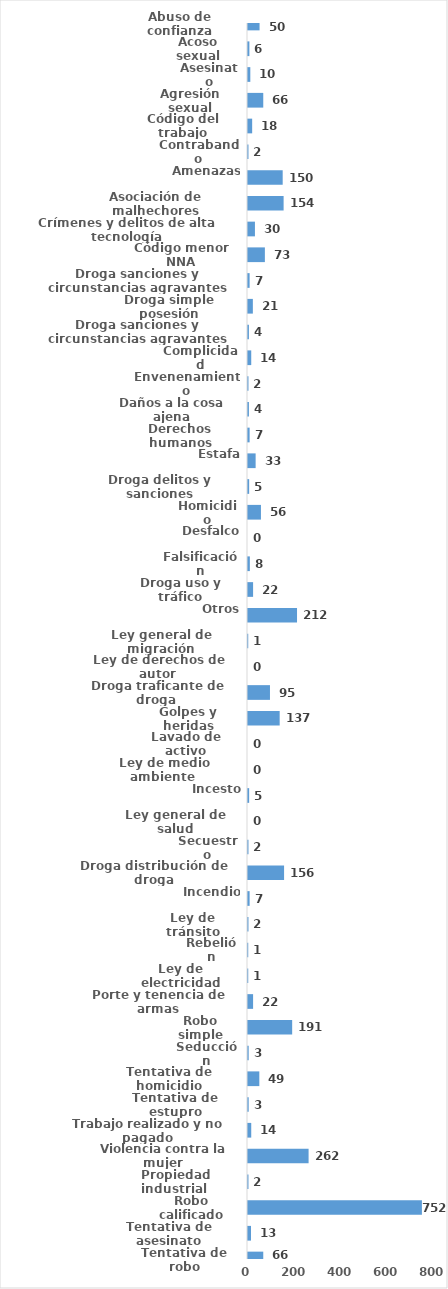
| Category | Series 0 |
|---|---|
| Abuso de confianza | 50 |
| Acoso sexual | 6 |
| Asesinato | 10 |
| Agresión sexual | 66 |
| Código del trabajo | 18 |
| Contrabando | 2 |
| Amenazas | 150 |
| Asociación de malhechores | 154 |
| Crímenes y delitos de alta tecnología | 30 |
| Código menor NNA | 73 |
| Droga sanciones y circunstancias agravantes | 7 |
| Droga simple posesión | 21 |
| Droga sanciones y circunstancias agravantes | 4 |
| Complicidad | 14 |
| Envenenamiento | 2 |
| Daños a la cosa ajena | 4 |
| Derechos humanos | 7 |
| Estafa | 33 |
| Droga delitos y sanciones | 5 |
| Homicidio | 56 |
| Desfalco | 0 |
| Falsificación | 8 |
| Droga uso y tráfico | 22 |
| Otros | 212 |
| Ley general de migración | 1 |
| Ley de derechos de autor  | 0 |
| Droga traficante de droga  | 95 |
| Golpes y heridas | 137 |
| Lavado de activo | 0 |
| Ley de medio ambiente  | 0 |
| Incesto | 5 |
| Ley general de salud | 0 |
| Secuestro | 2 |
| Droga distribución de droga | 156 |
| Incendio | 7 |
| Ley de tránsito | 2 |
| Rebelión | 1 |
| Ley de electricidad | 1 |
| Porte y tenencia de armas | 22 |
| Robo simple | 191 |
| Seducción | 3 |
| Tentativa de homicidio | 49 |
| Tentativa de estupro | 3 |
| Trabajo realizado y no pagado | 14 |
| Violencia contra la mujer | 262 |
| Propiedad industrial  | 2 |
| Robo calificado | 752 |
| Tentativa de asesinato | 13 |
| Tentativa de robo | 66 |